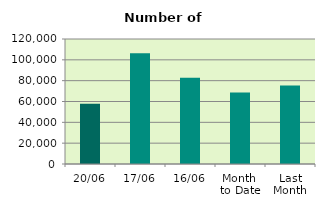
| Category | Series 0 |
|---|---|
| 20/06 | 57746 |
| 17/06 | 106380 |
| 16/06 | 82784 |
| Month 
to Date | 68666.857 |
| Last
Month | 75261.143 |